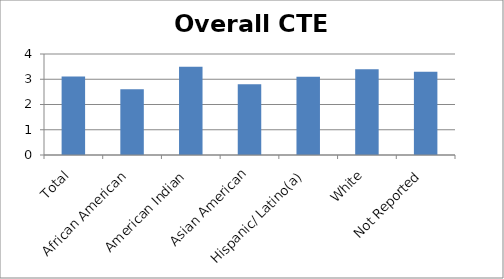
| Category | Overall CTE GPA |
|---|---|
| Total | 3.114 |
| African American | 2.6 |
| American Indian | 3.5 |
| Asian American | 2.8 |
| Hispanic/ Latino(a) | 3.1 |
| White | 3.4 |
| Not Reported | 3.3 |